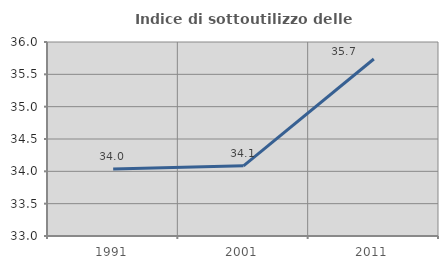
| Category | Indice di sottoutilizzo delle abitazioni  |
|---|---|
| 1991.0 | 34.035 |
| 2001.0 | 34.086 |
| 2011.0 | 35.737 |